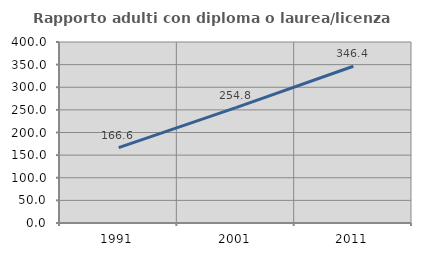
| Category | Rapporto adulti con diploma o laurea/licenza media  |
|---|---|
| 1991.0 | 166.639 |
| 2001.0 | 254.83 |
| 2011.0 | 346.441 |